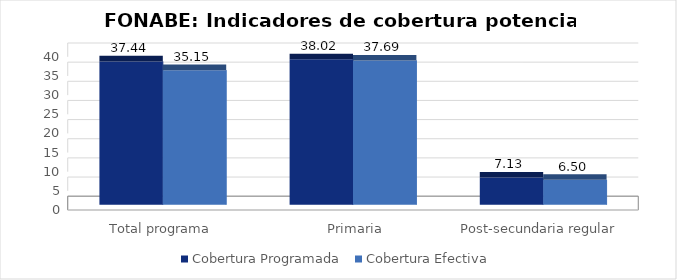
| Category | Cobertura Programada | Cobertura Efectiva |
|---|---|---|
| Total programa | 37.439 | 35.152 |
|   Primaria | 38.019 | 37.694 |
| Post-secundaria regular  | 7.125 | 6.503 |